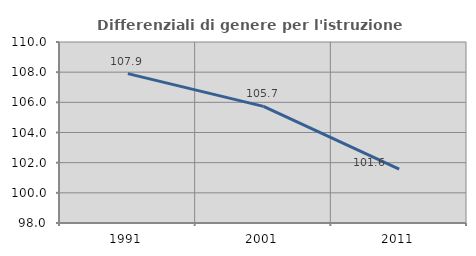
| Category | Differenziali di genere per l'istruzione superiore |
|---|---|
| 1991.0 | 107.905 |
| 2001.0 | 105.733 |
| 2011.0 | 101.578 |